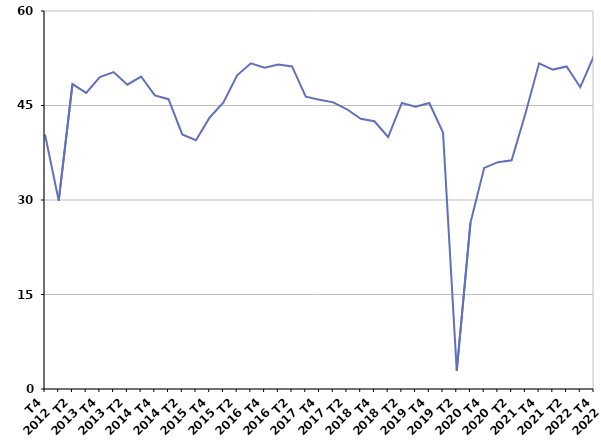
| Category | Radiation administrative |
|---|---|
| T4
2012 | 40.4 |
| T1
2013 | 29.9 |
| T2
2013 | 48.4 |
| T3
2013 | 47 |
| T4
2013 | 49.5 |
| T1
2014 | 50.3 |
| T2
2014 | 48.3 |
| T3
2014 | 49.6 |
| T4
2014 | 46.6 |
| T1
2015 | 46 |
| T2
2015 | 40.4 |
| T3
2015 | 39.5 |
| T4
2015 | 43.1 |
| T1
2016 | 45.5 |
| T2
2016 | 49.8 |
| T3
2016 | 51.7 |
| T4
2016 | 51 |
| T1
2017 | 51.5 |
| T2
2017 | 51.2 |
| T3
2017 | 46.4 |
| T4
2017 | 45.9 |
| T1
2018 | 45.5 |
| T2
2018 | 44.4 |
| T3
2018 | 42.9 |
| T4
2018 | 42.5 |
| T1
2019 | 40 |
| T2
2019 | 45.4 |
| T3
2019 | 44.8 |
| T4
2019 | 45.4 |
| T1
2020 | 40.7 |
| T2
2020 | 2.9 |
| T3
2020 | 26.4 |
| T4
2020 | 35.1 |
| T1
2021 | 36 |
| T2
2021 | 36.3 |
| T3
2021 | 43.7 |
| T4
2021 | 51.7 |
| T1
2022 | 50.7 |
| T2
2022 | 51.2 |
| T3
2022 | 47.9 |
| T4
2022 | 52.9 |